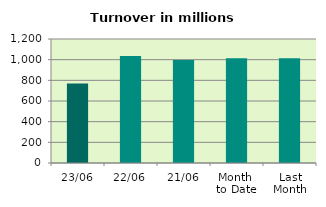
| Category | Series 0 |
|---|---|
| 23/06 | 768.407 |
| 22/06 | 1034.8 |
| 21/06 | 997.562 |
| Month 
to Date | 1012.502 |
| Last
Month | 1012.592 |